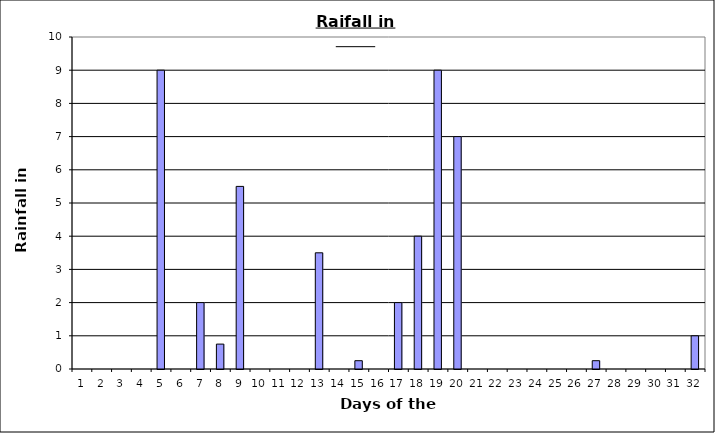
| Category | Series 0 |
|---|---|
| 0 | 0 |
| 1 | 0 |
| 2 | 0 |
| 3 | 0 |
| 4 | 9 |
| 5 | 0 |
| 6 | 2 |
| 7 | 0.75 |
| 8 | 5.5 |
| 9 | 0 |
| 10 | 0 |
| 11 | 0 |
| 12 | 3.5 |
| 13 | 0 |
| 14 | 0.25 |
| 15 | 0 |
| 16 | 2 |
| 17 | 4 |
| 18 | 9 |
| 19 | 7 |
| 20 | 0 |
| 21 | 0 |
| 22 | 0 |
| 23 | 0 |
| 24 | 0 |
| 25 | 0 |
| 26 | 0.25 |
| 27 | 0 |
| 28 | 0 |
| 29 | 0 |
| 30 | 0 |
| 31 | 1 |